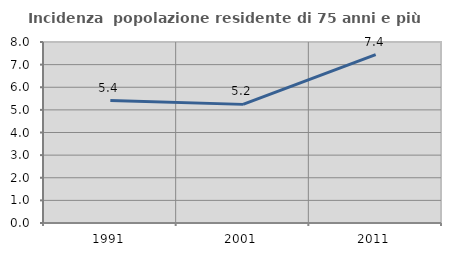
| Category | Incidenza  popolazione residente di 75 anni e più |
|---|---|
| 1991.0 | 5.413 |
| 2001.0 | 5.243 |
| 2011.0 | 7.442 |